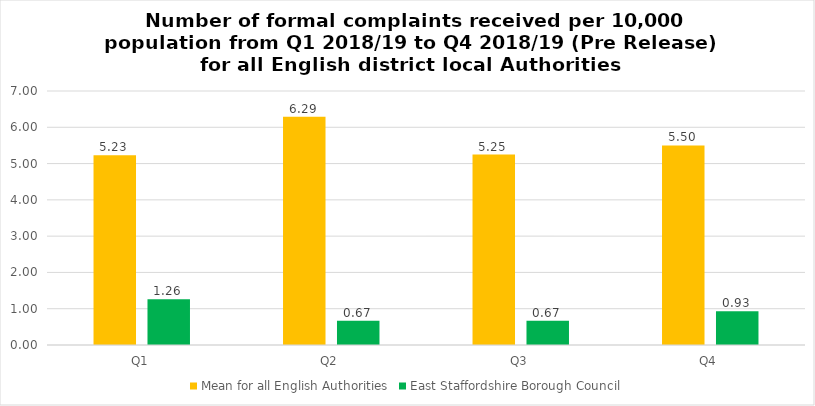
| Category | Mean for all English Authorities | East Staffordshire Borough Council |
|---|---|---|
| Q1 | 5.227 | 1.26 |
| Q2 | 6.29 | 0.67 |
| Q3 | 5.25 | 0.67 |
| Q4 | 5.498 | 0.93 |